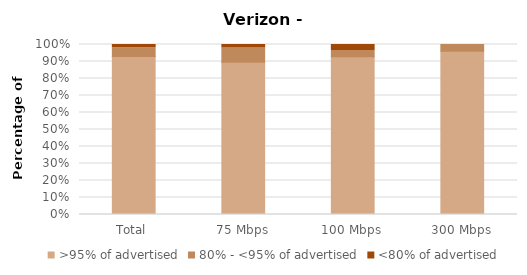
| Category | >95% of advertised | 80% - <95% of advertised | <80% of advertised |
|---|---|---|---|
| Total | 0.929 | 0.052 | 0.019 |
| 75 Mbps | 0.896 | 0.083 | 0.021 |
| 100 Mbps | 0.929 | 0.036 | 0.036 |
| 300 Mbps | 0.961 | 0.039 | 0 |